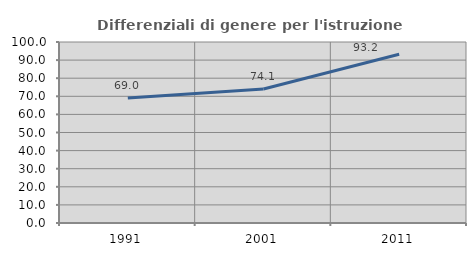
| Category | Differenziali di genere per l'istruzione superiore |
|---|---|
| 1991.0 | 69 |
| 2001.0 | 74.067 |
| 2011.0 | 93.208 |